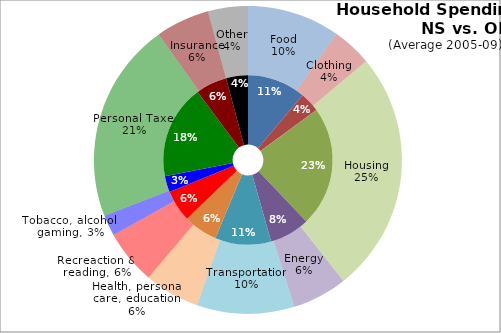
| Category | NS | ON |
|---|---|---|
| Food | 6520.4 | 7352.2 |
| Clothing | 2232.2 | 3172.2 |
| Housing | 13410.6 | 19245.4 |
| Energy | 4495.4 | 4354.4 |
| Transportation | 6259.2 | 7732.8 |
| Health, personal care, education | 3785.2 | 4398.8 |
| Recreaction & reading | 3526 | 4318 |
| Tobacco, alcohol, gaming | 1812.2 | 1666.2 |
| Personal Taxes | 10497 | 15920.4 |
| Insurance | 3483.6 | 4271.8 |
| Other | 2438.4 | 3170.8 |